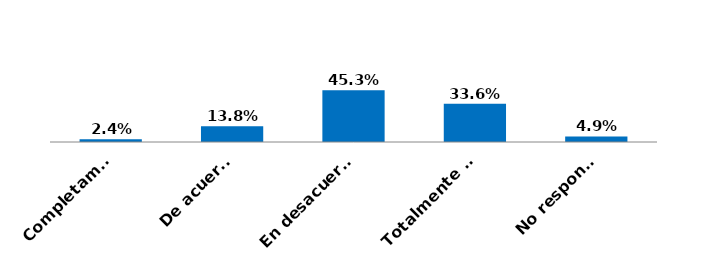
| Category | Series 0 |
|---|---|
| Completamente de acuerdo | 0.024 |
| De acuerdo | 0.138 |
| En desacuerdo | 0.453 |
| Totalmente en desacuerdo | 0.336 |
| No responde | 0.049 |